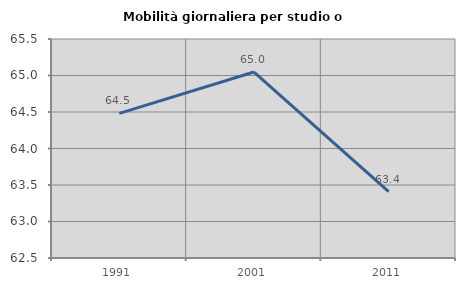
| Category | Mobilità giornaliera per studio o lavoro |
|---|---|
| 1991.0 | 64.48 |
| 2001.0 | 65.048 |
| 2011.0 | 63.411 |